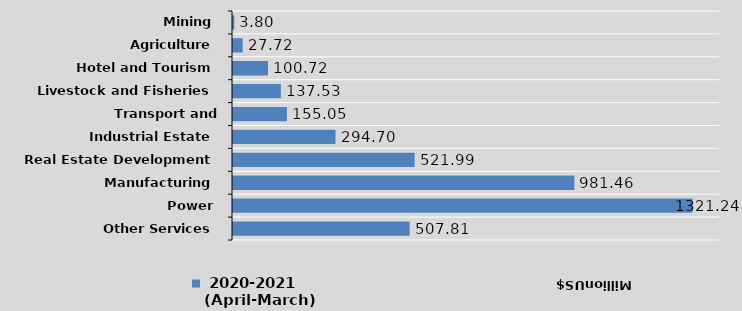
| Category |  2020-2021
(April-March) |
|---|---|
| Other Services | 507.81 |
| Power | 1321.24 |
| Manufacturing | 981.46 |
| Real Estate Development | 521.99 |
| Industrial Estate | 294.7 |
| Transport and Communication | 155.05 |
| Livestock and Fisheries | 137.53 |
| Hotel and Tourism | 100.72 |
| Agriculture | 27.72 |
| Mining | 3.8 |